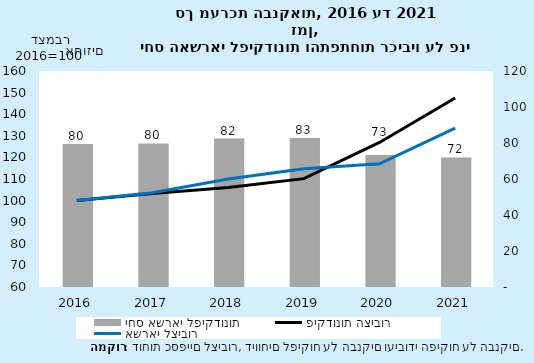
| Category | יחס אשראי לפיקדונות |
|---|---|
| 2016-12-31 | 79.502 |
| 2017-12-31 | 79.768 |
| 2018-12-31 | 82.452 |
| 2019-12-31 | 82.776 |
| 2020-12-31 | 73.304 |
| 2021-12-31 | 71.969 |